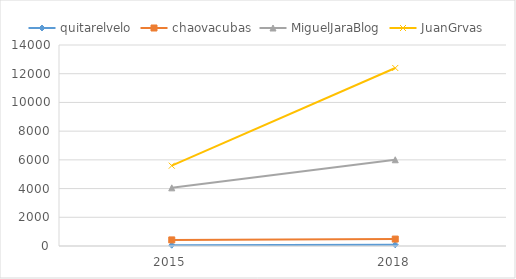
| Category | quitarelvelo | chaovacubas | MiguelJaraBlog | JuanGrvas |
|---|---|---|---|---|
| 2015.0 | 54 | 424 | 4051 | 5594 |
| 2018.0 | 85 | 483 | 6006 | 12400 |